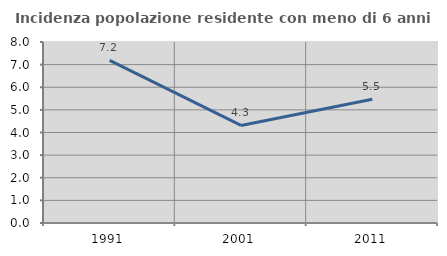
| Category | Incidenza popolazione residente con meno di 6 anni |
|---|---|
| 1991.0 | 7.186 |
| 2001.0 | 4.312 |
| 2011.0 | 5.47 |